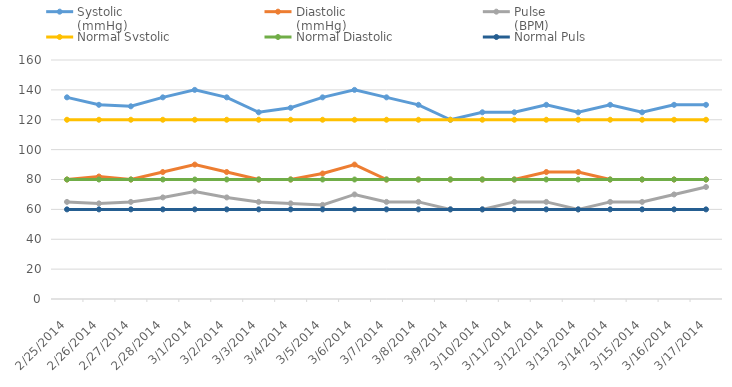
| Category | Systolic 
(mmHg) | Diastolic 
(mmHg) | Pulse 
(BPM) | Normal Systolic | Normal Diastolic | Normal Puls |
|---|---|---|---|---|---|---|
| 2/25/14 | 135 | 80 | 65 | 120 | 80 | 60 |
| 2/26/14 | 130 | 82 | 64 | 120 | 80 | 60 |
| 2/27/14 | 129 | 80 | 65 | 120 | 80 | 60 |
| 2/28/14 | 135 | 85 | 68 | 120 | 80 | 60 |
| 3/1/14 | 140 | 90 | 72 | 120 | 80 | 60 |
| 3/2/14 | 135 | 85 | 68 | 120 | 80 | 60 |
| 3/3/14 | 125 | 80 | 65 | 120 | 80 | 60 |
| 3/4/14 | 128 | 80 | 64 | 120 | 80 | 60 |
| 3/5/14 | 135 | 84 | 63 | 120 | 80 | 60 |
| 3/6/14 | 140 | 90 | 70 | 120 | 80 | 60 |
| 3/7/14 | 135 | 80 | 65 | 120 | 80 | 60 |
| 3/8/14 | 130 | 80 | 65 | 120 | 80 | 60 |
| 3/9/14 | 120 | 80 | 60 | 120 | 80 | 60 |
| 3/10/14 | 125 | 80 | 60 | 120 | 80 | 60 |
| 3/11/14 | 125 | 80 | 65 | 120 | 80 | 60 |
| 3/12/14 | 130 | 85 | 65 | 120 | 80 | 60 |
| 3/13/14 | 125 | 85 | 60 | 120 | 80 | 60 |
| 3/14/14 | 130 | 80 | 65 | 120 | 80 | 60 |
| 3/15/14 | 125 | 80 | 65 | 120 | 80 | 60 |
| 3/16/14 | 130 | 80 | 70 | 120 | 80 | 60 |
| 3/17/14 | 130 | 80 | 75 | 120 | 80 | 60 |